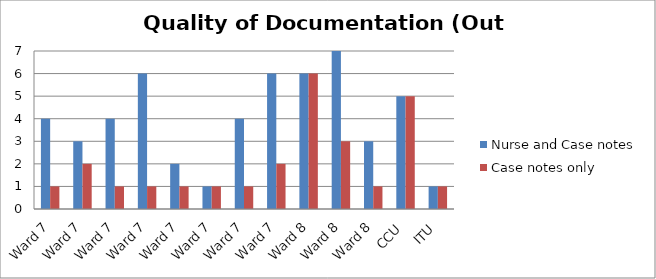
| Category | Nurse and Case notes | Case notes only |
|---|---|---|
| Ward 7 | 4 | 1 |
| Ward 7 | 3 | 2 |
| Ward 7 | 4 | 1 |
| Ward 7 | 6 | 1 |
| Ward 7 | 2 | 1 |
| Ward 7 | 1 | 1 |
| Ward 7 | 4 | 1 |
| Ward 7 | 6 | 2 |
| Ward 8 | 6 | 6 |
| Ward 8 | 7 | 3 |
| Ward 8 | 3 | 1 |
| CCU | 5 | 5 |
| ITU | 1 | 1 |